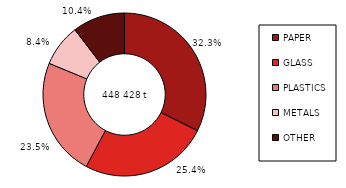
| Category | 2013 |
|---|---|
| PAPER | 145012.251 |
| GLASS | 114062.12 |
| PLASTICS | 105235.452 |
| METALS | 37460.832 |
| OTHER | 46657.497 |